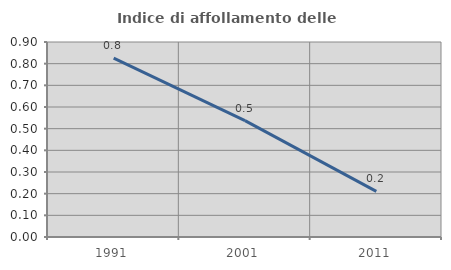
| Category | Indice di affollamento delle abitazioni  |
|---|---|
| 1991.0 | 0.825 |
| 2001.0 | 0.537 |
| 2011.0 | 0.211 |